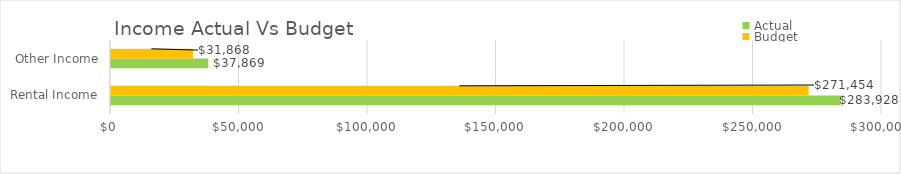
| Category | Actual | Budget |
|---|---|---|
| Rental Income | 283928 | 271454 |
| Other Income | 37869 | 31868 |